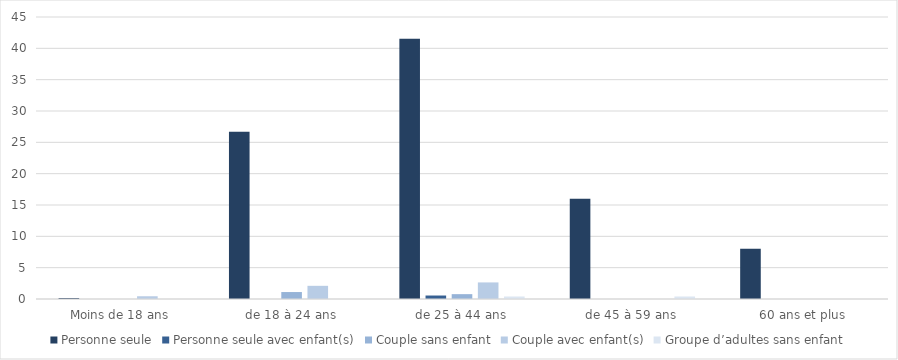
| Category | Personne seule | Personne seule avec enfant(s) | Couple sans enfant | Couple avec enfant(s) | Groupe d’adultes sans enfant |
|---|---|---|---|---|---|
| Moins de 18 ans | 0.157 | 0 | 0 | 0.439 | 0 |
| de 18 à 24 ans | 26.677 | 0 | 1.111 | 2.103 | 0 |
| de 25 à 44 ans | 41.511 | 0.556 | 0.774 | 2.646 | 0.399 |
| de 45 à 59 ans | 16 | 0 | 0 | 0 | 0.399 |
| 60 ans et plus | 8 | 0 | 0 | 0 | 0 |